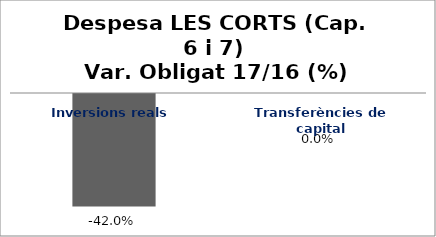
| Category | Series 0 |
|---|---|
| Inversions reals | -0.42 |
| Transferències de capital | 0 |